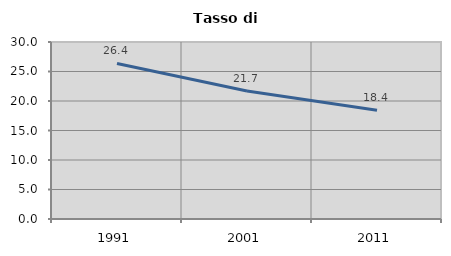
| Category | Tasso di disoccupazione   |
|---|---|
| 1991.0 | 26.36 |
| 2001.0 | 21.69 |
| 2011.0 | 18.444 |